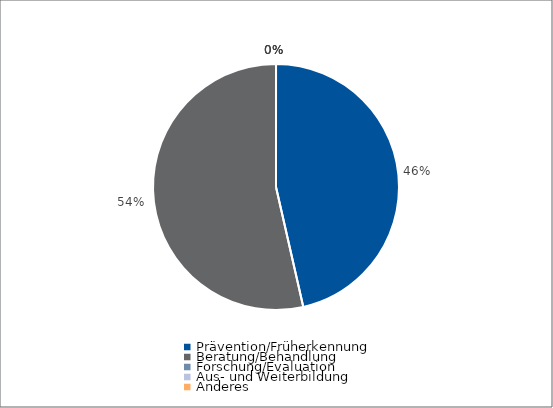
| Category | Series 0 |
|---|---|
| Prävention/Früherkennung | 72961.05 |
| Beratung/Behandlung | 84160 |
| Forschung/Evaluation | 0 |
| Aus- und Weiterbildung | 0 |
| Anderes | 0 |